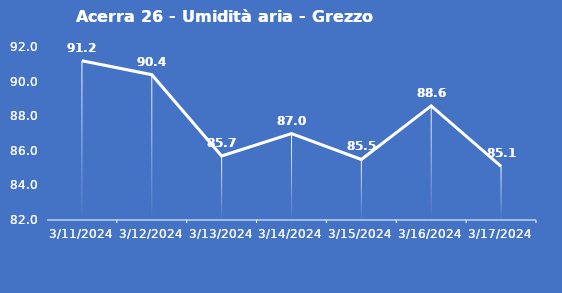
| Category | Acerra 26 - Umidità aria - Grezzo (%) |
|---|---|
| 3/11/24 | 91.2 |
| 3/12/24 | 90.4 |
| 3/13/24 | 85.7 |
| 3/14/24 | 87 |
| 3/15/24 | 85.5 |
| 3/16/24 | 88.6 |
| 3/17/24 | 85.1 |